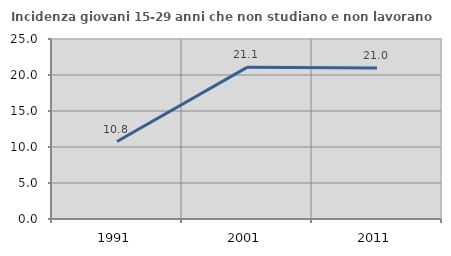
| Category | Incidenza giovani 15-29 anni che non studiano e non lavorano  |
|---|---|
| 1991.0 | 10.755 |
| 2001.0 | 21.063 |
| 2011.0 | 20.981 |